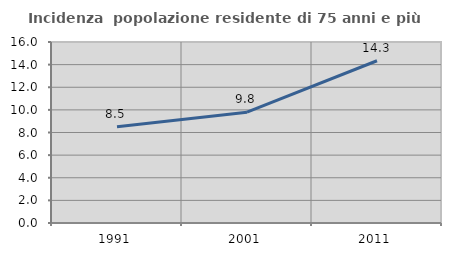
| Category | Incidenza  popolazione residente di 75 anni e più |
|---|---|
| 1991.0 | 8.509 |
| 2001.0 | 9.796 |
| 2011.0 | 14.342 |